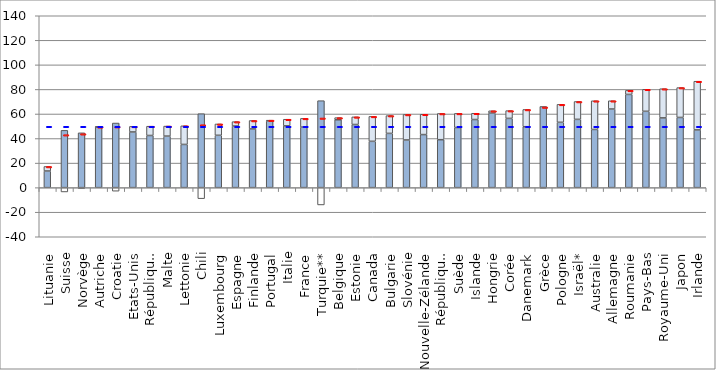
| Category | Revenus brut | Impôts nets | Transferts nets |
|---|---|---|---|
| Lituanie | 13.544 | 0 | 3.708 |
| Suisse | 46.669 | -3.52 | 0 |
| Norvège | 44.65 | -0.746 | 0 |
| Autriche | 49.485 | 0 | 0.08 |
| Croatie | 52.627 | -2.891 | 0 |
| Etats-Unis | 45.348 | 0 | 4.557 |
| République tchèque | 42.485 | 0 | 7.554 |
| Malte | 41.977 | 0 | 8.17 |
| Lettonie | 35.195 | 0 | 15.17 |
| Chili | 60.228 | -8.975 | 0 |
| Luxembourg | 42.642 | 0 | 9.237 |
| Espagne | 50.177 | 0 | 3.568 |
| Finlande | 47.82 | 0 | 6.872 |
| Portugal | 54.301 | 0 | 0.655 |
| Italie | 50.323 | 0 | 5.402 |
| France | 49.304 | 0 | 7.111 |
| Turquie** | 70.828 | -14.093 | 0 |
| Belgique | 55.261 | 0 | 1.764 |
| Estonie | 51.432 | 0 | 6.207 |
| Canada | 37.724 | 0 | 20.317 |
| Bulgarie | 44.196 | 0 | 14.483 |
| Slovénie | 38.835 | 0 | 20.779 |
| Nouvelle-Zélande | 43.229 | 0 | 16.532 |
| République slovaque | 39.064 | 0 | 21.337 |
| Suède | 48.976 | 0 | 11.494 |
| Islande | 55.486 | 0 | 5.108 |
| Hongrie | 60.732 | 0 | 1.86 |
| Corée | 56.408 | 0 | 6.314 |
| Danemark | 49.622 | 0 | 14.057 |
| Grèce | 66.119 | -0.452 | 0 |
| Pologne | 53.21 | 0 | 14.634 |
| Israël* | 55.617 | 0 | 14.545 |
| Australie | 47.394 | 0 | 23.351 |
| Allemagne | 64.046 | 0 | 6.734 |
| Roumanie | 75.924 | 0 | 3.319 |
| Pays-Bas | 62.17 | 0 | 17.94 |
| Royaume-Uni | 56.816 | 0 | 23.758 |
| Japon | 57.175 | 0 | 24.317 |
| Irlande | 47.023 | 0 | 39.656 |